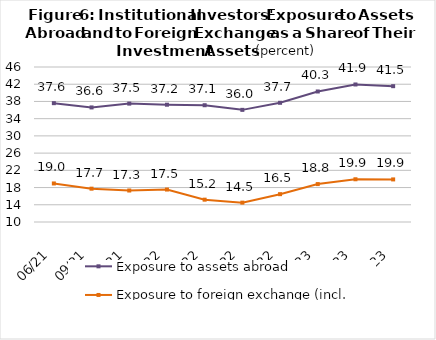
| Category | Exposure to assets abroad | Exposure to foreign exchange (incl. derivatives) |
|---|---|---|
| 2021-06-30 | 37.601 | 18.953 |
| 2021-09-30 | 36.61 | 17.74 |
| 2021-12-31 | 37.497 | 17.314 |
| 2022-03-31 | 37.241 | 17.538 |
| 2022-06-30 | 37.122 | 15.186 |
| 2022-09-30 | 36.045 | 14.495 |
| 2022-12-31 | 37.687 | 16.465 |
| 2023-03-31 | 40.315 | 18.806 |
| 2023-06-30 | 41.942 | 19.926 |
| 2023-09-30 | 41.546 | 19.891 |